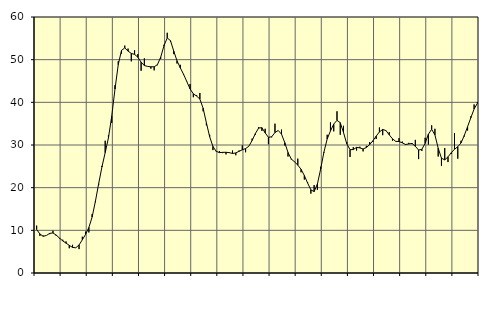
| Category | Piggar | Series 1 |
|---|---|---|
| nan | 11.1 | 10.21 |
| 87.0 | 8.7 | 9.15 |
| 87.0 | 8.8 | 8.6 |
| 87.0 | 8.8 | 8.8 |
| nan | 9.1 | 9.29 |
| 88.0 | 9.9 | 9.39 |
| 88.0 | 8.7 | 8.89 |
| 88.0 | 8 | 8.18 |
| nan | 7.8 | 7.52 |
| 89.0 | 7.4 | 7 |
| 89.0 | 5.8 | 6.48 |
| 89.0 | 6.6 | 6 |
| nan | 5.9 | 5.91 |
| 90.0 | 5.6 | 6.58 |
| 90.0 | 8.5 | 7.78 |
| 90.0 | 9.7 | 9.07 |
| nan | 9.5 | 10.66 |
| 91.0 | 13.8 | 13.12 |
| 91.0 | 16.6 | 16.79 |
| 91.0 | 20.6 | 20.93 |
| nan | 25.1 | 24.85 |
| 92.0 | 31 | 28.22 |
| 92.0 | 32.3 | 31.69 |
| 92.0 | 35.2 | 36.75 |
| nan | 44 | 43.11 |
| 93.0 | 49.6 | 48.84 |
| 93.0 | 51.4 | 52.18 |
| 93.0 | 53.3 | 52.75 |
| nan | 52.6 | 52.01 |
| 94.0 | 49.6 | 51.46 |
| 94.0 | 52.2 | 51.23 |
| 94.0 | 51.3 | 50.59 |
| nan | 47.4 | 49.42 |
| 95.0 | 50.3 | 48.62 |
| 95.0 | 48.4 | 48.42 |
| 95.0 | 47.9 | 48.33 |
| nan | 47.5 | 48.33 |
| 96.0 | 48.7 | 48.84 |
| 96.0 | 50.2 | 50.58 |
| 96.0 | 53.5 | 53.26 |
| nan | 56.3 | 55.09 |
| 97.0 | 54.2 | 54.45 |
| 97.0 | 51.3 | 52 |
| 97.0 | 49.1 | 49.74 |
| nan | 48.8 | 48.09 |
| 98.0 | 46.4 | 46.58 |
| 98.0 | 44.8 | 44.87 |
| 98.0 | 44.3 | 43.14 |
| nan | 41.2 | 41.99 |
| 99.0 | 41.7 | 41.47 |
| 99.0 | 42.2 | 40.76 |
| 99.0 | 37.9 | 38.61 |
| nan | 34.6 | 35.19 |
| 0.0 | 32.4 | 31.94 |
| 0.0 | 28.8 | 29.66 |
| 0.0 | 28.6 | 28.51 |
| nan | 28.6 | 28.22 |
| 1.0 | 28.1 | 28.28 |
| 1.0 | 27.8 | 28.29 |
| 1.0 | 28.3 | 28.21 |
| nan | 28.7 | 28.02 |
| 2.0 | 27.6 | 28.14 |
| 2.0 | 28.7 | 28.51 |
| 2.0 | 29.9 | 28.88 |
| nan | 28.3 | 29.16 |
| 3.0 | 29.7 | 29.7 |
| 3.0 | 31.5 | 31.05 |
| 3.0 | 32.4 | 32.68 |
| nan | 34.2 | 33.97 |
| 4.0 | 33.3 | 34.06 |
| 4.0 | 33.8 | 32.85 |
| 4.0 | 30.2 | 31.8 |
| nan | 31.8 | 31.93 |
| 5.0 | 35 | 32.91 |
| 5.0 | 33.4 | 33.41 |
| 5.0 | 33.6 | 32.55 |
| nan | 29.9 | 30.57 |
| 6.0 | 27.3 | 28.24 |
| 6.0 | 26.6 | 26.72 |
| 6.0 | 26.1 | 26.05 |
| nan | 26.8 | 25.29 |
| 7.0 | 23.6 | 24.3 |
| 7.0 | 21.9 | 22.85 |
| 7.0 | 21.3 | 21.09 |
| nan | 18.6 | 19.49 |
| 8.0 | 20.6 | 19.08 |
| 8.0 | 19.5 | 20.84 |
| 8.0 | 24.9 | 24.37 |
| nan | 28.2 | 28.34 |
| 9.0 | 32.4 | 31.41 |
| 9.0 | 35.3 | 33.29 |
| 9.0 | 33.2 | 34.91 |
| nan | 37.9 | 35.78 |
| 10.0 | 32.4 | 35.23 |
| 10.0 | 34.5 | 32.92 |
| 10.0 | 30.7 | 30.28 |
| nan | 27.2 | 28.91 |
| 11.0 | 29.5 | 28.92 |
| 11.0 | 28.7 | 29.45 |
| 11.0 | 29.6 | 29.32 |
| nan | 28.5 | 29.07 |
| 12.0 | 29.8 | 29.4 |
| 12.0 | 30.7 | 30.09 |
| 12.0 | 30.7 | 30.98 |
| nan | 31.4 | 32.08 |
| 13.0 | 34.1 | 33.06 |
| 13.0 | 32.3 | 33.65 |
| 13.0 | 33.3 | 33.38 |
| nan | 33 | 32.39 |
| 14.0 | 31 | 31.45 |
| 14.0 | 30.9 | 30.85 |
| 14.0 | 31.6 | 30.81 |
| nan | 30.8 | 30.51 |
| 15.0 | 30 | 30.12 |
| 15.0 | 30.5 | 30.24 |
| 15.0 | 30.2 | 30.36 |
| nan | 31.2 | 29.69 |
| 16.0 | 26.7 | 28.82 |
| 16.0 | 28.6 | 28.99 |
| 16.0 | 31.7 | 30.41 |
| nan | 30.1 | 32.53 |
| 17.0 | 34.6 | 33.68 |
| 17.0 | 33.8 | 32.36 |
| 17.0 | 27.3 | 29.25 |
| nan | 25.1 | 26.91 |
| 18.0 | 29.3 | 26.51 |
| 18.0 | 26 | 27.22 |
| 18.0 | 27.9 | 28.18 |
| nan | 32.8 | 29.01 |
| 19.0 | 26.8 | 29.6 |
| 19.0 | 31 | 30.49 |
| 19.0 | 32 | 32.24 |
| nan | 33.4 | 34.29 |
| 20.0 | 36.7 | 36.38 |
| 20.0 | 39.5 | 38.44 |
| 20.0 | 40.1 | 39.77 |